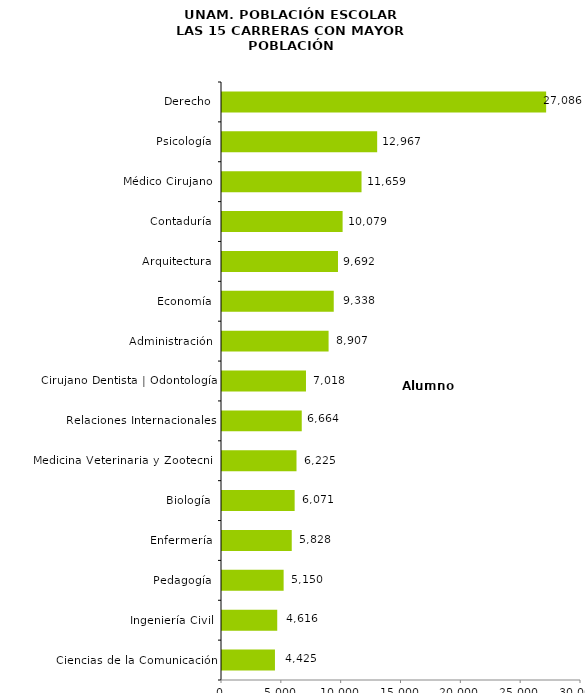
| Category | Ciencias de la Comunicación Ingeniería Civil Pedagogía Enfermería Biología Medicina Veterinaria y Zootecnia Relaciones Internacionales Cirujano Dentista | Odontología Administración Economía Arquitectura Contaduría Médico Cirujano Psicología Derecho |
|---|---|
| Ciencias de la Comunicación | 4425 |
| Ingeniería Civil | 4616 |
| Pedagogía | 5150 |
| Enfermería | 5828 |
| Biología | 6071 |
| Medicina Veterinaria y Zootecnia | 6225 |
| Relaciones Internacionales | 6664 |
| Cirujano Dentista | Odontología | 7018 |
| Administración | 8907 |
| Economía | 9338 |
| Arquitectura | 9692 |
| Contaduría | 10079 |
| Médico Cirujano | 11659 |
| Psicología | 12967 |
| Derecho | 27086 |